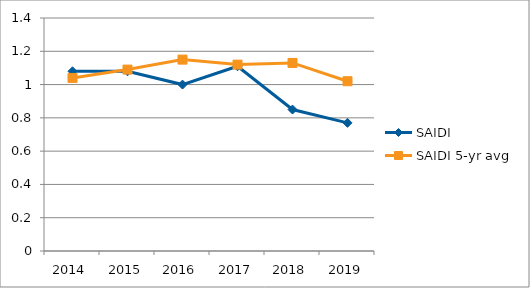
| Category | SAIDI | SAIDI 5-yr avg |
|---|---|---|
| 2014.0 | 1.08 | 1.04 |
| 2015.0 | 1.08 | 1.09 |
| 2016.0 | 1 | 1.15 |
| 2017.0 | 1.11 | 1.12 |
| 2018.0 | 0.85 | 1.13 |
| 2019.0 | 0.77 | 1.02 |